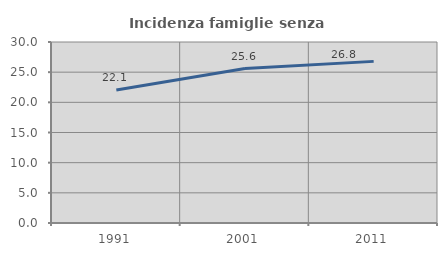
| Category | Incidenza famiglie senza nuclei |
|---|---|
| 1991.0 | 22.054 |
| 2001.0 | 25.6 |
| 2011.0 | 26.789 |